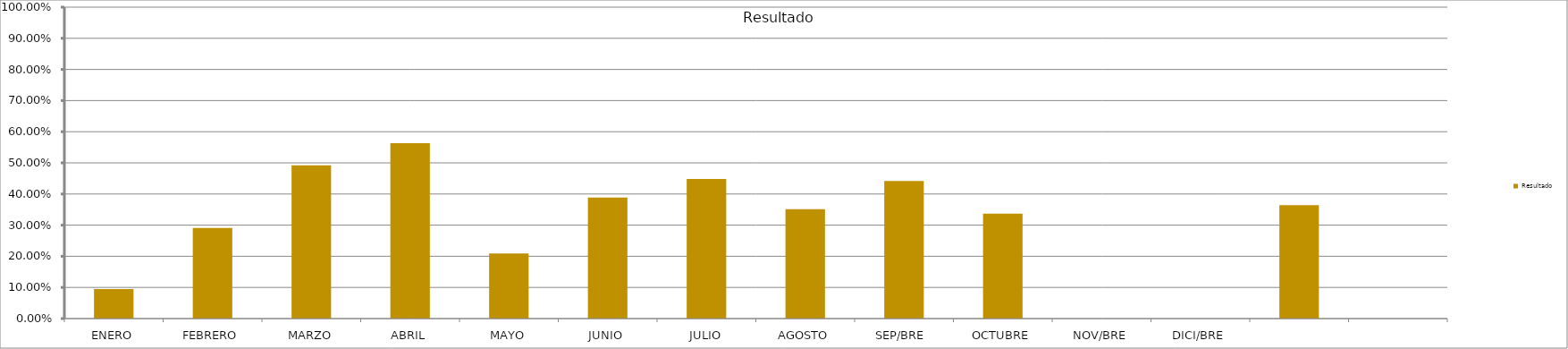
| Category | Resultado  |
|---|---|
| ENERO | 0.095 |
| FEBRERO | 0.291 |
| MARZO | 0.492 |
| ABRIL | 0.564 |
| MAYO | 0.209 |
| JUNIO | 0.389 |
| JULIO | 0.448 |
| AGOSTO | 0.351 |
| SEP/BRE  | 0.442 |
| OCTUBRE | 0.337 |
| NOV/BRE | 0 |
| DICI/BRE | 0 |